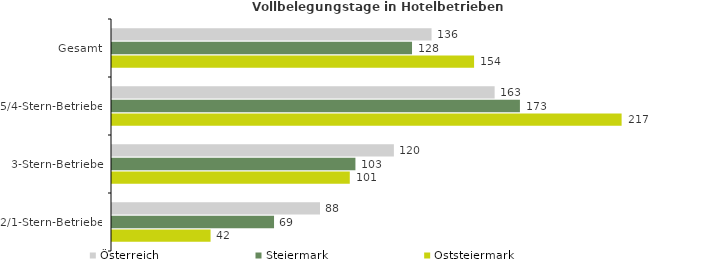
| Category | Österreich | Steiermark | Oststeiermark |
|---|---|---|---|
| Gesamt | 135.866 | 127.561 | 153.944 |
| 5/4-Stern-Betriebe | 162.683 | 173.435 | 216.673 |
| 3-Stern-Betriebe | 119.851 | 103.499 | 101.096 |
| 2/1-Stern-Betriebe | 88.435 | 68.894 | 41.908 |